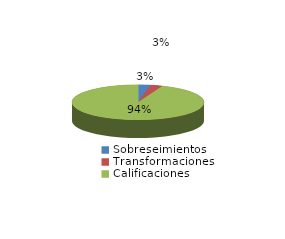
| Category | Series 0 |
|---|---|
| Sobreseimientos | 6 |
| Transformaciones | 6 |
| Calificaciones | 192 |